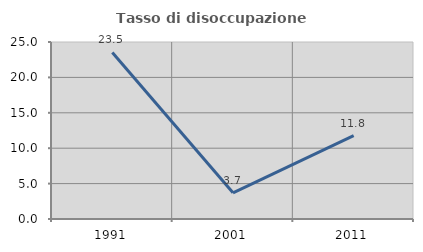
| Category | Tasso di disoccupazione giovanile  |
|---|---|
| 1991.0 | 23.529 |
| 2001.0 | 3.704 |
| 2011.0 | 11.765 |